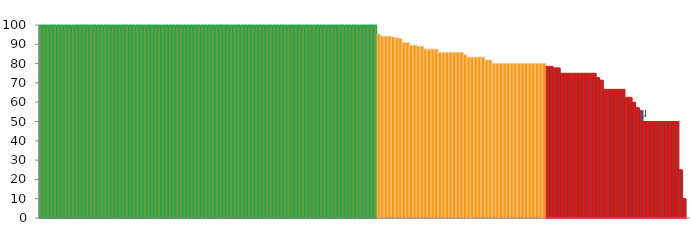
| Category | Top Quartile | 2nd Quartile | 3rd Quartile | Bottom Quartile | Series 4 |
|---|---|---|---|---|---|
|  | 100 | 0 | 0 | 0 | 100 |
|  | 100 | 0 | 0 | 0 | 100 |
|  | 100 | 0 | 0 | 0 | 100 |
|  | 100 | 0 | 0 | 0 | 100 |
|  | 100 | 0 | 0 | 0 | 100 |
|  | 100 | 0 | 0 | 0 | 100 |
|  | 100 | 0 | 0 | 0 | 100 |
|  | 100 | 0 | 0 | 0 | 100 |
|  | 100 | 0 | 0 | 0 | 100 |
|  | 100 | 0 | 0 | 0 | 100 |
|  | 100 | 0 | 0 | 0 | 100 |
|  | 100 | 0 | 0 | 0 | 100 |
|  | 100 | 0 | 0 | 0 | 100 |
|  | 100 | 0 | 0 | 0 | 100 |
|  | 100 | 0 | 0 | 0 | 100 |
|  | 100 | 0 | 0 | 0 | 100 |
|  | 100 | 0 | 0 | 0 | 100 |
|  | 100 | 0 | 0 | 0 | 100 |
|  | 100 | 0 | 0 | 0 | 100 |
|  | 100 | 0 | 0 | 0 | 100 |
|  | 100 | 0 | 0 | 0 | 100 |
|  | 100 | 0 | 0 | 0 | 100 |
|  | 100 | 0 | 0 | 0 | 100 |
|  | 100 | 0 | 0 | 0 | 100 |
|  | 100 | 0 | 0 | 0 | 100 |
|  | 100 | 0 | 0 | 0 | 100 |
|  | 100 | 0 | 0 | 0 | 100 |
|  | 100 | 0 | 0 | 0 | 100 |
|  | 100 | 0 | 0 | 0 | 100 |
|  | 100 | 0 | 0 | 0 | 100 |
|  | 100 | 0 | 0 | 0 | 100 |
|  | 100 | 0 | 0 | 0 | 100 |
|  | 100 | 0 | 0 | 0 | 100 |
|  | 100 | 0 | 0 | 0 | 100 |
|  | 100 | 0 | 0 | 0 | 100 |
|  | 100 | 0 | 0 | 0 | 100 |
|  | 100 | 0 | 0 | 0 | 100 |
|  | 100 | 0 | 0 | 0 | 100 |
|  | 100 | 0 | 0 | 0 | 100 |
|  | 100 | 0 | 0 | 0 | 100 |
|  | 100 | 0 | 0 | 0 | 100 |
|  | 100 | 0 | 0 | 0 | 100 |
|  | 100 | 0 | 0 | 0 | 100 |
|  | 100 | 0 | 0 | 0 | 100 |
|  | 100 | 0 | 0 | 0 | 100 |
|  | 100 | 0 | 0 | 0 | 100 |
|  | 100 | 0 | 0 | 0 | 100 |
|  | 100 | 0 | 0 | 0 | 100 |
|  | 100 | 0 | 0 | 0 | 100 |
|  | 100 | 0 | 0 | 0 | 100 |
|  | 100 | 0 | 0 | 0 | 100 |
|  | 100 | 0 | 0 | 0 | 100 |
|  | 100 | 0 | 0 | 0 | 100 |
|  | 100 | 0 | 0 | 0 | 100 |
|  | 100 | 0 | 0 | 0 | 100 |
|  | 100 | 0 | 0 | 0 | 100 |
|  | 100 | 0 | 0 | 0 | 100 |
|  | 100 | 0 | 0 | 0 | 100 |
|  | 100 | 0 | 0 | 0 | 100 |
|  | 100 | 0 | 0 | 0 | 100 |
|  | 100 | 0 | 0 | 0 | 100 |
|  | 100 | 0 | 0 | 0 | 100 |
|  | 100 | 0 | 0 | 0 | 100 |
|  | 100 | 0 | 0 | 0 | 100 |
|  | 100 | 0 | 0 | 0 | 100 |
|  | 100 | 0 | 0 | 0 | 100 |
|  | 100 | 0 | 0 | 0 | 100 |
|  | 100 | 0 | 0 | 0 | 100 |
|  | 100 | 0 | 0 | 0 | 100 |
|  | 100 | 0 | 0 | 0 | 100 |
|  | 100 | 0 | 0 | 0 | 100 |
|  | 100 | 0 | 0 | 0 | 100 |
|  | 100 | 0 | 0 | 0 | 100 |
|  | 100 | 0 | 0 | 0 | 100 |
|  | 100 | 0 | 0 | 0 | 100 |
|  | 100 | 0 | 0 | 0 | 100 |
|  | 100 | 0 | 0 | 0 | 100 |
|  | 100 | 0 | 0 | 0 | 100 |
|  | 100 | 0 | 0 | 0 | 100 |
|  | 100 | 0 | 0 | 0 | 100 |
|  | 100 | 0 | 0 | 0 | 100 |
|  | 100 | 0 | 0 | 0 | 100 |
|  | 100 | 0 | 0 | 0 | 100 |
|  | 100 | 0 | 0 | 0 | 100 |
|  | 100 | 0 | 0 | 0 | 100 |
|  | 100 | 0 | 0 | 0 | 100 |
|  | 100 | 0 | 0 | 0 | 100 |
|  | 100 | 0 | 0 | 0 | 100 |
|  | 100 | 0 | 0 | 0 | 100 |
|  | 100 | 0 | 0 | 0 | 100 |
|  | 100 | 0 | 0 | 0 | 100 |
|  | 100 | 0 | 0 | 0 | 100 |
|  | 100 | 0 | 0 | 0 | 100 |
|  | 100 | 0 | 0 | 0 | 100 |
|  | 0 | 0 | 95.238 | 0 | 95.238 |
|  | 0 | 0 | 94.118 | 0 | 94.118 |
|  | 0 | 0 | 94.118 | 0 | 94.118 |
|  | 0 | 0 | 94.118 | 0 | 94.118 |
|  | 0 | 0 | 93.75 | 0 | 93.75 |
|  | 0 | 0 | 93.333 | 0 | 93.333 |
|  | 0 | 0 | 92.857 | 0 | 92.857 |
|  | 0 | 0 | 90.909 | 0 | 90.909 |
|  | 0 | 0 | 90.909 | 0 | 90.909 |
|  | 0 | 0 | 89.474 | 0 | 89.474 |
|  | 0 | 0 | 89.474 | 0 | 89.474 |
|  | 0 | 0 | 88.889 | 0 | 88.889 |
|  | 0 | 0 | 88.889 | 0 | 88.889 |
|  | 0 | 0 | 87.5 | 0 | 87.5 |
|  | 0 | 0 | 87.5 | 0 | 87.5 |
|  | 0 | 0 | 87.5 | 0 | 87.5 |
|  | 0 | 0 | 87.5 | 0 | 87.5 |
|  | 0 | 0 | 85.714 | 0 | 85.714 |
|  | 0 | 0 | 85.714 | 0 | 85.714 |
|  | 0 | 0 | 85.714 | 0 | 85.714 |
|  | 0 | 0 | 85.714 | 0 | 85.714 |
|  | 0 | 0 | 85.714 | 0 | 85.714 |
|  | 0 | 0 | 85.714 | 0 | 85.714 |
|  | 0 | 0 | 85.714 | 0 | 85.714 |
|  | 0 | 0 | 84.615 | 0 | 84.615 |
|  | 0 | 0 | 83.333 | 0 | 83.333 |
|  | 0 | 0 | 83.333 | 0 | 83.333 |
|  | 0 | 0 | 83.333 | 0 | 83.333 |
|  | 0 | 0 | 83.333 | 0 | 83.333 |
|  | 0 | 0 | 83.333 | 0 | 83.333 |
|  | 0 | 0 | 81.818 | 0 | 81.818 |
|  | 0 | 0 | 81.818 | 0 | 81.818 |
|  | 0 | 0 | 80 | 0 | 80 |
|  | 0 | 0 | 80 | 0 | 80 |
|  | 0 | 0 | 80 | 0 | 80 |
|  | 0 | 0 | 80 | 0 | 80 |
|  | 0 | 0 | 80 | 0 | 80 |
|  | 0 | 0 | 80 | 0 | 80 |
|  | 0 | 0 | 80 | 0 | 80 |
|  | 0 | 0 | 80 | 0 | 80 |
|  | 0 | 0 | 80 | 0 | 80 |
|  | 0 | 0 | 80 | 0 | 80 |
|  | 0 | 0 | 80 | 0 | 80 |
|  | 0 | 0 | 80 | 0 | 80 |
|  | 0 | 0 | 80 | 0 | 80 |
|  | 0 | 0 | 80 | 0 | 80 |
|  | 0 | 0 | 80 | 0 | 80 |
|  | 0 | 0 | 0 | 78.571 | 78.571 |
|  | 0 | 0 | 0 | 78.571 | 78.571 |
|  | 0 | 0 | 0 | 77.778 | 77.778 |
|  | 0 | 0 | 0 | 77.778 | 77.778 |
|  | 0 | 0 | 0 | 75 | 75 |
|  | 0 | 0 | 0 | 75 | 75 |
|  | 0 | 0 | 0 | 75 | 75 |
|  | 0 | 0 | 0 | 75 | 75 |
|  | 0 | 0 | 0 | 75 | 75 |
|  | 0 | 0 | 0 | 75 | 75 |
|  | 0 | 0 | 0 | 75 | 75 |
|  | 0 | 0 | 0 | 75 | 75 |
|  | 0 | 0 | 0 | 75 | 75 |
|  | 0 | 0 | 0 | 75 | 75 |
|  | 0 | 0 | 0 | 72.727 | 72.727 |
|  | 0 | 0 | 0 | 71.429 | 71.429 |
|  | 0 | 0 | 0 | 66.667 | 66.667 |
|  | 0 | 0 | 0 | 66.667 | 66.667 |
|  | 0 | 0 | 0 | 66.667 | 66.667 |
|  | 0 | 0 | 0 | 66.667 | 66.667 |
|  | 0 | 0 | 0 | 66.667 | 66.667 |
|  | 0 | 0 | 0 | 66.667 | 66.667 |
|  | 0 | 0 | 0 | 62.5 | 62.5 |
|  | 0 | 0 | 0 | 62.5 | 62.5 |
|  | 0 | 0 | 0 | 60 | 60 |
|  | 0 | 0 | 0 | 57.143 | 57.143 |
|  | 0 | 0 | 0 | 55.556 | 55.556 |
| u | 0 | 0 | 0 | 50 | 50 |